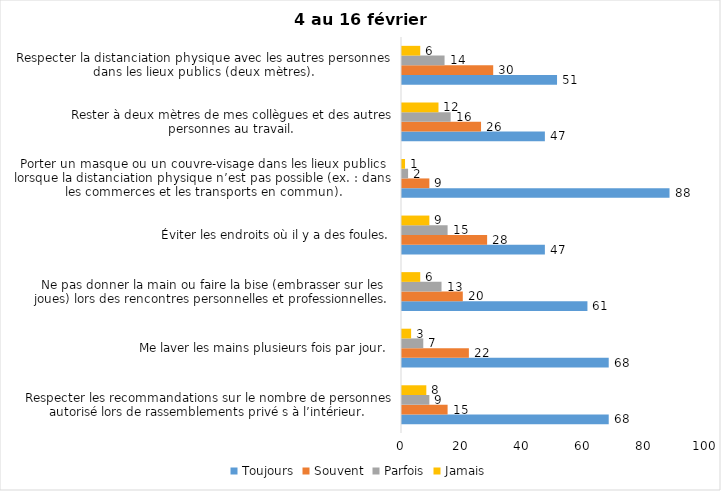
| Category | Toujours | Souvent | Parfois | Jamais |
|---|---|---|---|---|
| Respecter les recommandations sur le nombre de personnes autorisé lors de rassemblements privé s à l’intérieur. | 68 | 15 | 9 | 8 |
| Me laver les mains plusieurs fois par jour. | 68 | 22 | 7 | 3 |
| Ne pas donner la main ou faire la bise (embrasser sur les joues) lors des rencontres personnelles et professionnelles. | 61 | 20 | 13 | 6 |
| Éviter les endroits où il y a des foules. | 47 | 28 | 15 | 9 |
| Porter un masque ou un couvre-visage dans les lieux publics lorsque la distanciation physique n’est pas possible (ex. : dans les commerces et les transports en commun). | 88 | 9 | 2 | 1 |
| Rester à deux mètres de mes collègues et des autres personnes au travail. | 47 | 26 | 16 | 12 |
| Respecter la distanciation physique avec les autres personnes dans les lieux publics (deux mètres). | 51 | 30 | 14 | 6 |